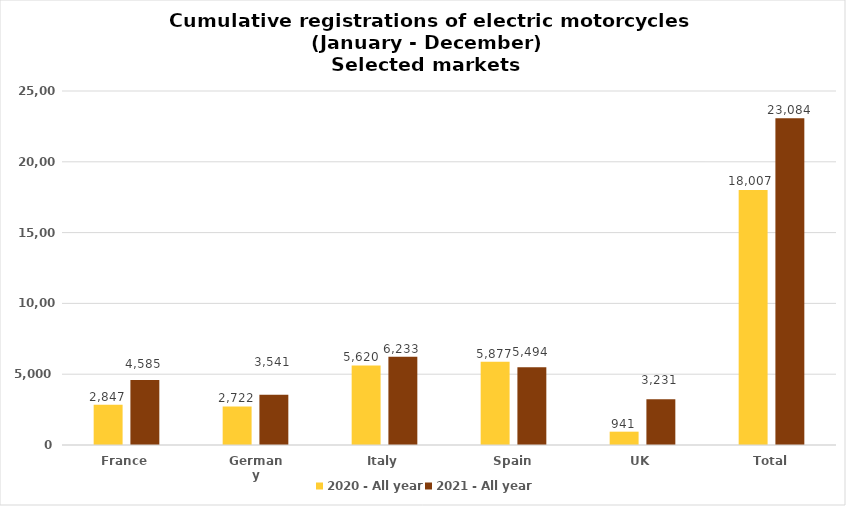
| Category | 2020 - All year | 2021 - All year |
|---|---|---|
| France | 2847 | 4585 |
| Germany | 2722 | 3541 |
| Italy | 5620 | 6233 |
| Spain | 5877 | 5494 |
| UK | 941 | 3231 |
| Total | 18007 | 23084 |